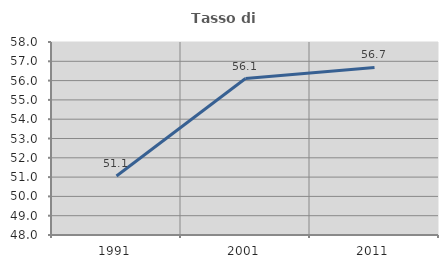
| Category | Tasso di occupazione   |
|---|---|
| 1991.0 | 51.055 |
| 2001.0 | 56.105 |
| 2011.0 | 56.682 |